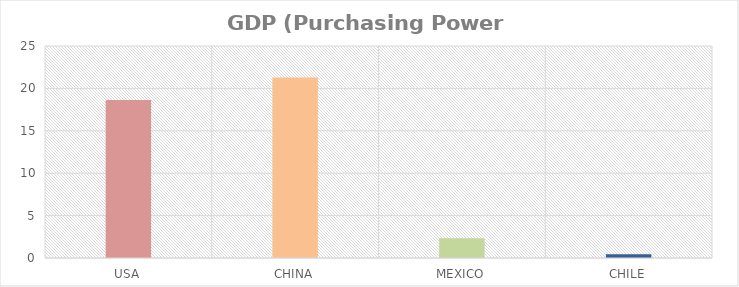
| Category | GDP (Purchasing Power Parity) |
|---|---|
| USA | 18.62 |
| CHINA | 21.29 |
| MEXICO | 2.315 |
| CHILE | 0.438 |